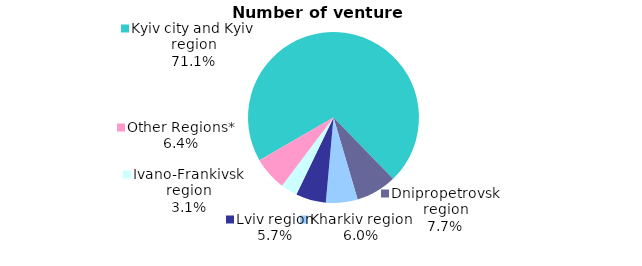
| Category | Series 0 |
|---|---|
| Kyiv city and Kyiv region | 0.711 |
| Dnipropetrovsk region | 0.077 |
| Kharkiv region | 0.06 |
| Lviv region | 0.057 |
| Ivano-Frankivsk region | 0.031 |
| Other Regions* | 0.064 |